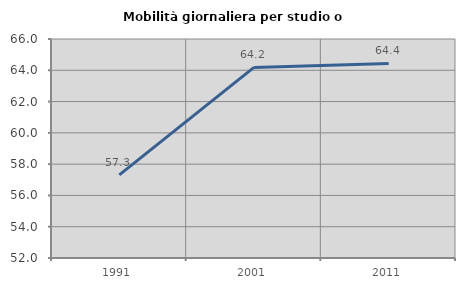
| Category | Mobilità giornaliera per studio o lavoro |
|---|---|
| 1991.0 | 57.319 |
| 2001.0 | 64.183 |
| 2011.0 | 64.435 |